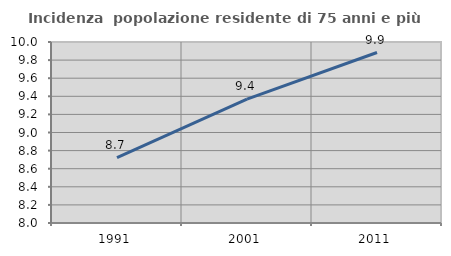
| Category | Incidenza  popolazione residente di 75 anni e più |
|---|---|
| 1991.0 | 8.723 |
| 2001.0 | 9.368 |
| 2011.0 | 9.884 |